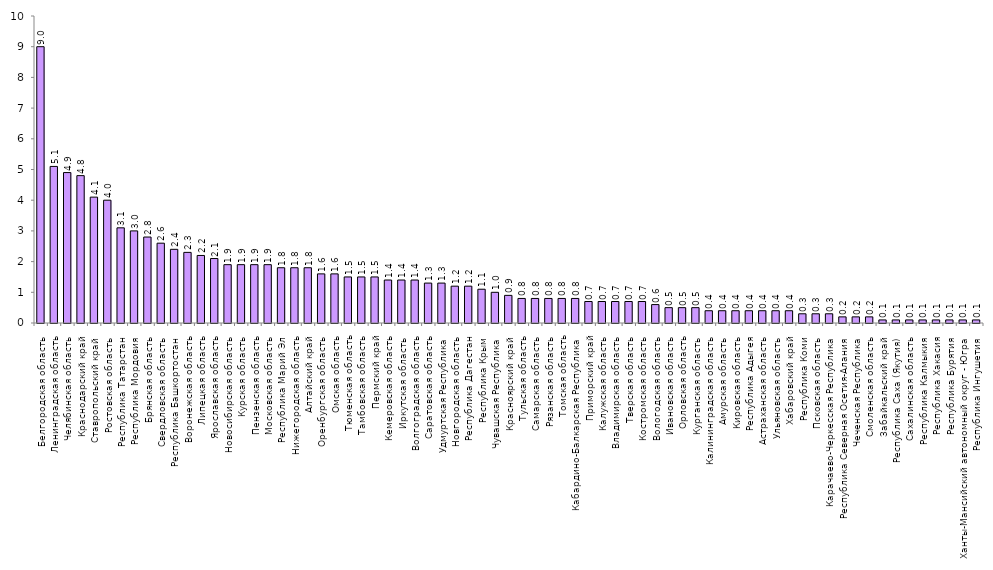
| Category | Series 0 |
|---|---|
| Белгородская область | 9 |
| Ленинградская область | 5.1 |
| Челябинская область | 4.9 |
| Краснодарский край | 4.8 |
| Ставропольский край | 4.1 |
| Ростовская область | 4 |
| Республика Татарстан | 3.1 |
| Республика Мордовия | 3 |
| Брянская область | 2.8 |
| Свердловская область | 2.6 |
| Республика Башкортостан | 2.4 |
| Воронежская область | 2.3 |
| Липецкая область | 2.2 |
| Ярославская область | 2.1 |
| Новосибирская область | 1.9 |
| Курская область | 1.9 |
| Пензенская область | 1.9 |
| Московская область | 1.9 |
| Республика Марий Эл | 1.8 |
| Нижегородская область | 1.8 |
| Алтайский край | 1.8 |
| Оренбургская область | 1.6 |
| Омская область | 1.6 |
| Тюменская область | 1.5 |
| Тамбовская область | 1.5 |
| Пермский край | 1.5 |
| Кемеровская область | 1.4 |
| Иркутская область | 1.4 |
| Волгоградская область | 1.4 |
| Саратовская область | 1.3 |
| Удмуртская Республика | 1.3 |
| Новгородская область | 1.2 |
| Республика Дагестан | 1.2 |
| Республика Крым | 1.1 |
| Чувашская Республика | 1 |
| Красноярский край | 0.9 |
| Тульская область | 0.8 |
| Самарская область | 0.8 |
| Рязанская область | 0.8 |
| Томская область | 0.8 |
| Кабардино-Балкарская Республика | 0.8 |
| Приморский край | 0.7 |
| Калужская область | 0.7 |
| Владимирская область | 0.7 |
| Тверская область | 0.7 |
| Костромская область | 0.7 |
| Вологодская область | 0.6 |
| Ивановская область | 0.5 |
| Орловская область | 0.5 |
| Курганская область | 0.5 |
| Калининградская область | 0.4 |
| Амурская область | 0.4 |
| Кировская область | 0.4 |
| Республика Адыгея | 0.4 |
| Астраханская область | 0.4 |
| Ульяновская область | 0.4 |
| Хабаровский край | 0.4 |
| Республика Коми | 0.3 |
| Псковская область | 0.3 |
| Карачаево-Черкесская Республика | 0.3 |
| Республика Северная Осетия-Алания | 0.2 |
| Чеченская Республика | 0.2 |
| Смоленская область | 0.2 |
| Забайкальский край | 0.1 |
| Республика Саха (Якутия) | 0.1 |
| Сахалинская область | 0.1 |
| Республика Калмыкия | 0.1 |
| Республика Хакасия | 0.1 |
| Республика Бурятия | 0.1 |
| Ханты-Мансийский автономный округ - Югра | 0.1 |
| Республика Ингушетия | 0.1 |